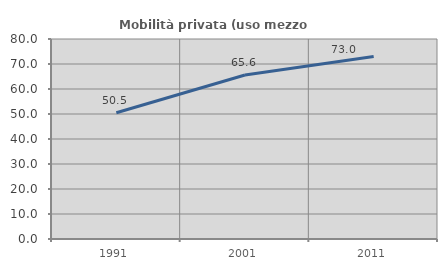
| Category | Mobilità privata (uso mezzo privato) |
|---|---|
| 1991.0 | 50.521 |
| 2001.0 | 65.614 |
| 2011.0 | 73.028 |